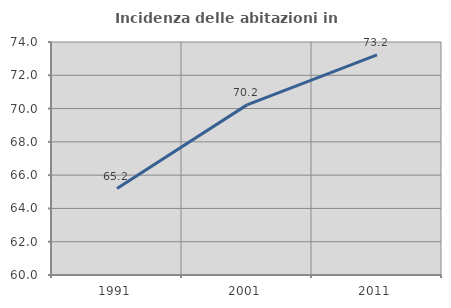
| Category | Incidenza delle abitazioni in proprietà  |
|---|---|
| 1991.0 | 65.196 |
| 2001.0 | 70.222 |
| 2011.0 | 73.231 |